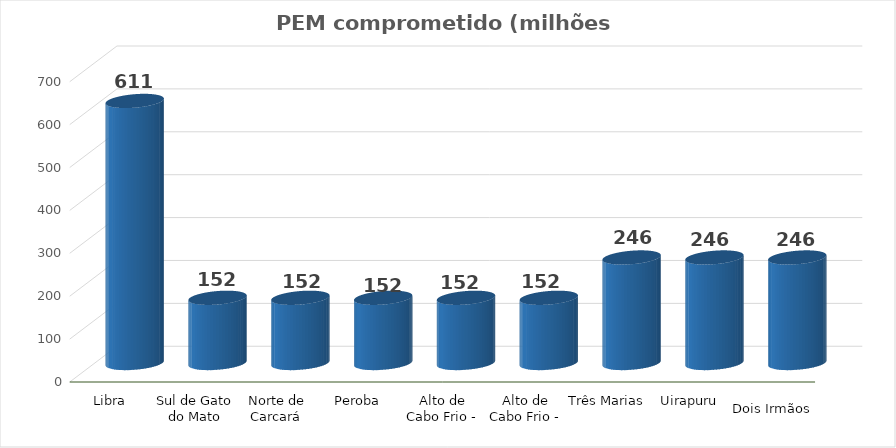
| Category | PEM arrematado (milhões R$) |
|---|---|
| Libra | 610.9 |
| Sul de Gato do Mato | 152 |
| Norte de Carcará | 152 |
| Peroba | 152 |
| Alto de Cabo Frio - Oeste | 152 |
| Alto de Cabo Frio - Central | 152 |
| Três Marias | 246 |
| Uirapuru | 246 |
| Dois Irmãos | 246 |